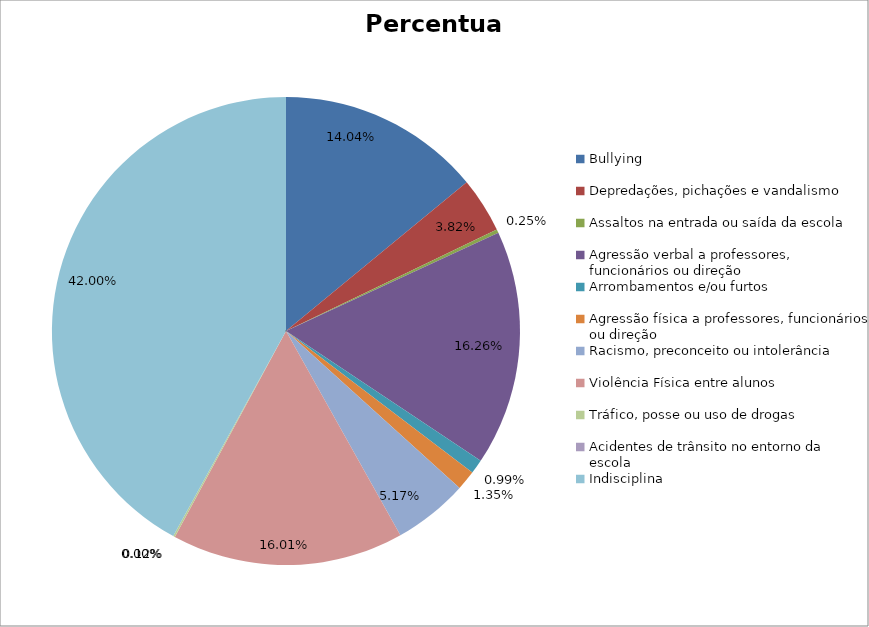
| Category | Percentual |
|---|---|
| Bullying | 0.14 |
| Depredações, pichações e vandalismo | 0.038 |
| Assaltos na entrada ou saída da escola | 0.002 |
| Agressão verbal a professores, funcionários ou direção | 0.163 |
| Arrombamentos e/ou furtos | 0.01 |
| Agressão física a professores, funcionários ou direção | 0.014 |
| Racismo, preconceito ou intolerância | 0.052 |
| Violência Física entre alunos | 0.16 |
| Tráfico, posse ou uso de drogas | 0.001 |
| Acidentes de trânsito no entorno da escola | 0 |
| Indisciplina | 0.42 |